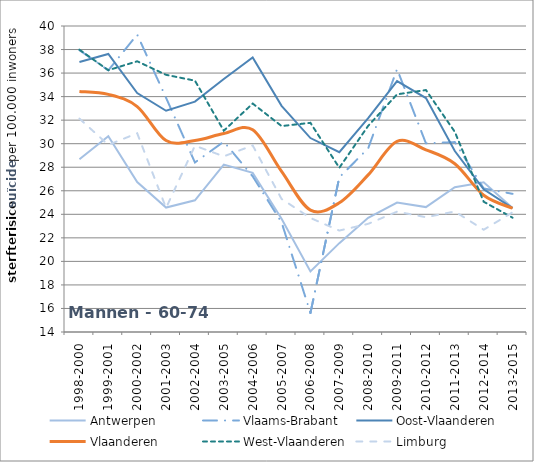
| Category | Antwerpen | Vlaams-Brabant | Oost-Vlaanderen | Vlaanderen | West-Vlaanderen | Limburg |
|---|---|---|---|---|---|---|
| 1998-2000 | 28.682 | 37.943 | 36.948 | 34.438 | 37.988 | 32.13 |
| 1999-2001 | 30.638 | 36.233 | 37.621 | 34.193 | 36.245 | 29.898 |
| 2000-2002 | 26.739 | 39.271 | 34.305 | 33.152 | 37.001 | 30.886 |
| 2001-2003 | 24.574 | 33.897 | 32.8 | 30.266 | 35.852 | 24.541 |
| 2002-2004 | 25.194 | 28.404 | 33.576 | 30.269 | 35.355 | 29.827 |
| 2003-2005 | 28.218 | 30.173 | 35.491 | 30.858 | 31.101 | 28.926 |
| 2004-2006 | 27.519 | 27.226 | 37.319 | 31.184 | 33.411 | 29.853 |
| 2005-2007 | 23.627 | 23.32 | 33.219 | 27.64 | 31.498 | 25.309 |
| 2006-2008 | 19.147 | 15.621 | 30.478 | 24.359 | 31.771 | 23.688 |
| 2007-2009 | 21.551 | 27.137 | 29.282 | 24.975 | 27.951 | 22.618 |
| 2008-2010 | 23.7 | 29.607 | 32.18 | 27.348 | 31.519 | 23.191 |
| 2009-2011 | 24.993 | 36.338 | 35.32 | 30.192 | 34.195 | 24.225 |
| 2010-2012 | 24.612 | 30.029 | 33.877 | 29.479 | 34.558 | 23.753 |
| 2011-2013 | 26.308 | 30.138 | 29.378 | 28.296 | 31.008 | 24.237 |
| 2012-2014 | 26.728 | 26.198 | 26.121 | 25.616 | 25.069 | 22.689 |
| 2013-2015 | 24.534 | 25.739 | 24.527 | 24.514 | 23.711 | 24.17 |